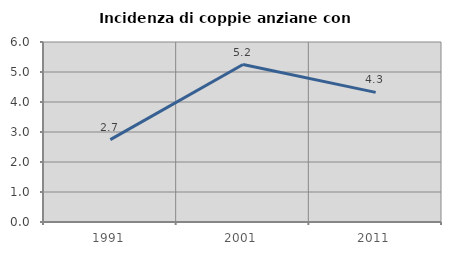
| Category | Incidenza di coppie anziane con figli |
|---|---|
| 1991.0 | 2.746 |
| 2001.0 | 5.248 |
| 2011.0 | 4.321 |